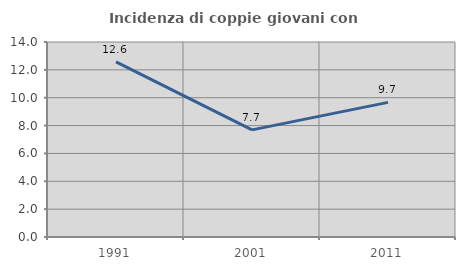
| Category | Incidenza di coppie giovani con figli |
|---|---|
| 1991.0 | 12.577 |
| 2001.0 | 7.692 |
| 2011.0 | 9.665 |